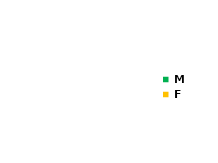
| Category | Series 0 |
|---|---|
| M | 0 |
| F | 0 |